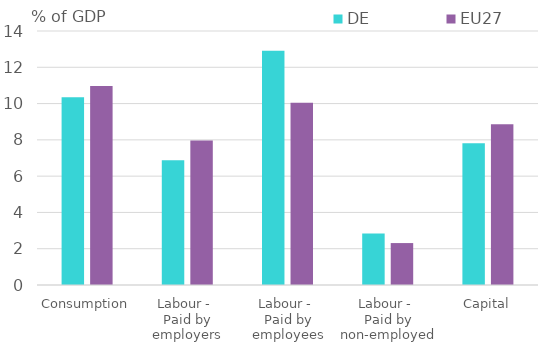
| Category | DE | EU27 |
|---|---|---|
| Consumption | 10.347 | 10.967 |
| Labour - 
Paid by employers | 6.877 | 7.966 |
| Labour - 
Paid by employees | 12.914 | 10.052 |
| Labour - 
Paid by non-employed | 2.837 | 2.311 |
| Capital | 7.815 | 8.858 |